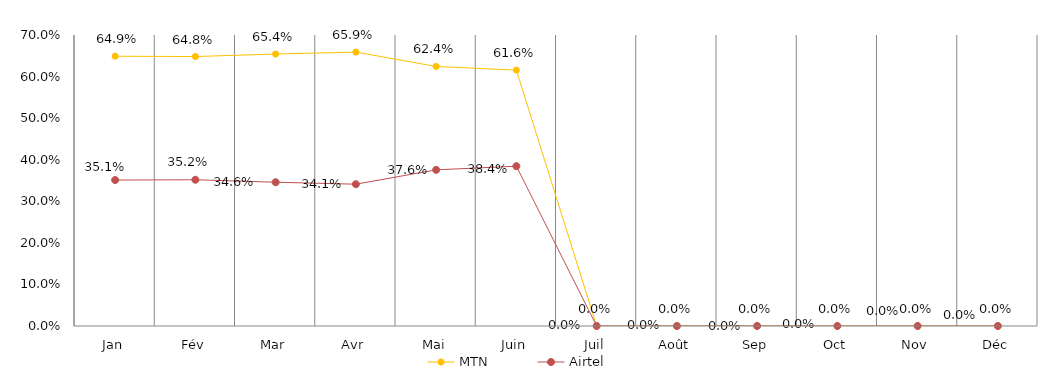
| Category | MTN | Airtel |
|---|---|---|
| Jan | 0.649 | 0.351 |
| Fév | 0.648 | 0.352 |
| Mar | 0.654 | 0.346 |
| Avr | 0.659 | 0.341 |
| Mai | 0.624 | 0.376 |
| Juin | 0.616 | 0.384 |
| Juil | 0 | 0 |
| Août | 0 | 0 |
| Sep | 0 | 0 |
| Oct | 0 | 0 |
| Nov | 0 | 0 |
| Déc | 0 | 0 |